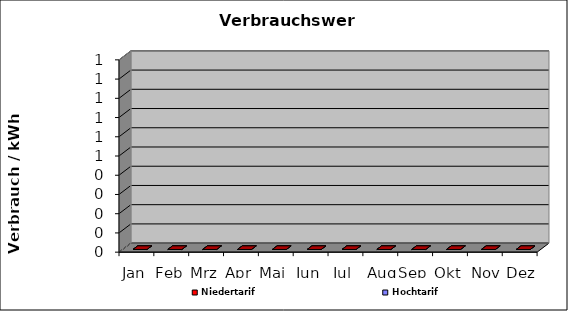
| Category | Hochtarif | Niedertarif |
|---|---|---|
| Jan | 0 | 0 |
| Feb | 0 | 0 |
| Mrz | 0 | 0 |
| Apr | 0 | 0 |
| Mai | 0 | 0 |
| Jun | 0 | 0 |
| Jul | 0 | 0 |
| Aug | 0 | 0 |
| Sep | 0 | 0 |
| Okt | 0 | 0 |
| Nov | 0 | 0 |
| Dez | 0 | 0 |